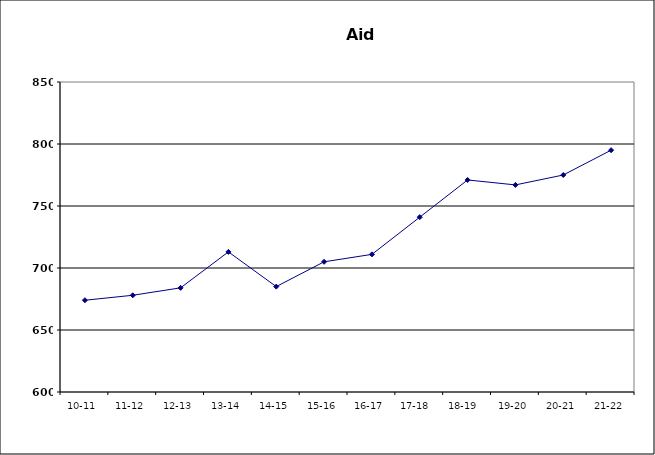
| Category | Series 0 |
|---|---|
| 10-11 | 674 |
| 11-12 | 678 |
| 12-13 | 684 |
| 13-14 | 713 |
| 14-15 | 685 |
| 15-16 | 705 |
| 16-17 | 711 |
| 17-18  | 741 |
| 18-19  | 771 |
| 19-20 | 767 |
| 20-21 | 775 |
| 21-22 | 795 |